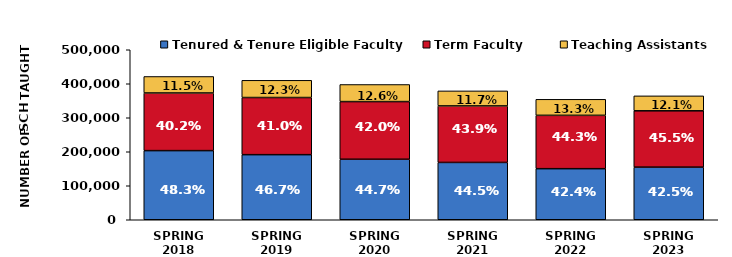
| Category | Tenured & Tenure Eligible Faculty | Term Faculty | Teaching Assistants |
|---|---|---|---|
| SPRING 2018 | 203344 | 169521.9 | 48517 |
| SPRING 2019 | 191437.3 | 168047.8 | 50631 |
| SPRING 2020 | 177980.1 | 169568.1 | 50283.7 |
| SPRING 2021 | 168587.2 | 166232.4 | 44166.9 |
| SPRING 2022 | 150186.078 | 156924.137 | 47155.465 |
| SPRING 2023 | 154788.328 | 165621.421 | 43955.532 |